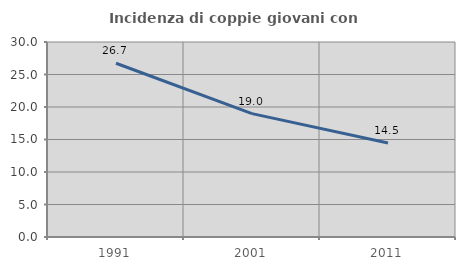
| Category | Incidenza di coppie giovani con figli |
|---|---|
| 1991.0 | 26.73 |
| 2001.0 | 18.978 |
| 2011.0 | 14.471 |